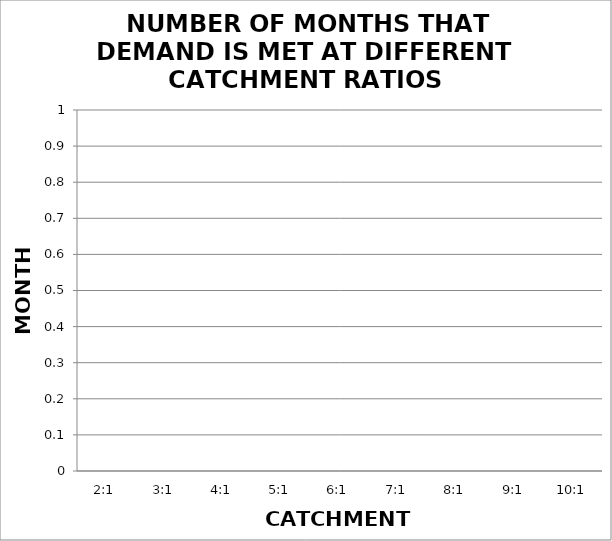
| Category |  NUMBER OF MONTHS THAT DEMAND IS MET AT DIFFERENT CATCHMENT RATIOS |
|---|---|
| 2:1 | 0 |
| 3:1 | 0 |
| 4:1 | 0 |
| 5:1 | 0 |
| 6:1 | 0 |
| 7:1 | 0 |
| 8:1 | 0 |
| 9:1 | 0 |
| 10:1 | 0 |